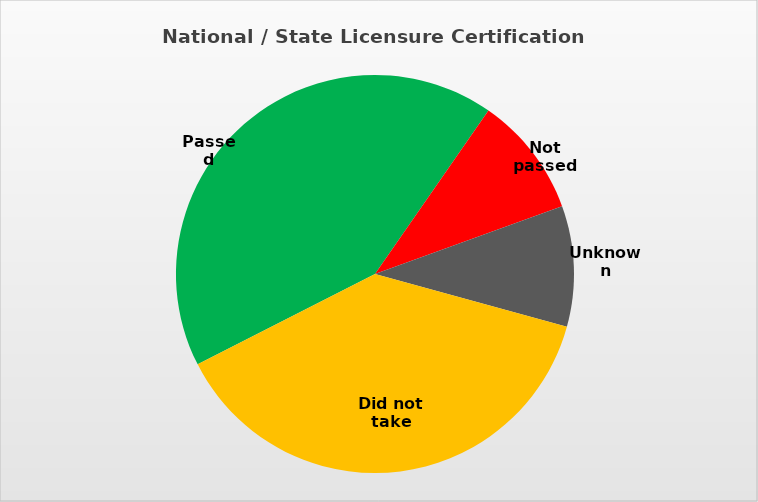
| Category | Series 0 |
|---|---|
| Passed | 0.422 |
| Not passed | 0.098 |
| Unknown | 0.098 |
| Did not take | 0.382 |